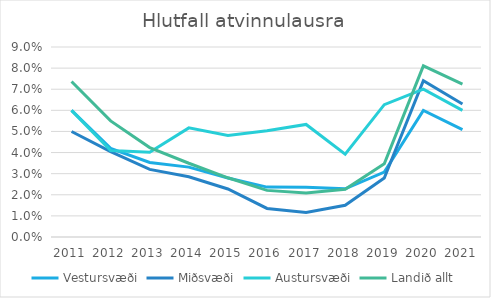
| Category | Vestursvæði | Miðsvæði | Austursvæði | Landið allt |
|---|---|---|---|---|
| 2011.0 | 0.06 | 0.05 | 0.06 | 0.074 |
| 2012.0 | 0.042 | 0.04 | 0.041 | 0.055 |
| 2013.0 | 0.035 | 0.032 | 0.04 | 0.042 |
| 2014.0 | 0.033 | 0.029 | 0.052 | 0.035 |
| 2015.0 | 0.028 | 0.023 | 0.048 | 0.028 |
| 2016.0 | 0.024 | 0.014 | 0.05 | 0.022 |
| 2017.0 | 0.024 | 0.012 | 0.053 | 0.021 |
| 2018.0 | 0.023 | 0.015 | 0.039 | 0.023 |
| 2019.0 | 0.031 | 0.028 | 0.063 | 0.035 |
| 2020.0 | 0.06 | 0.074 | 0.07 | 0.081 |
| 2021.0 | 0.051 | 0.063 | 0.06 | 0.072 |